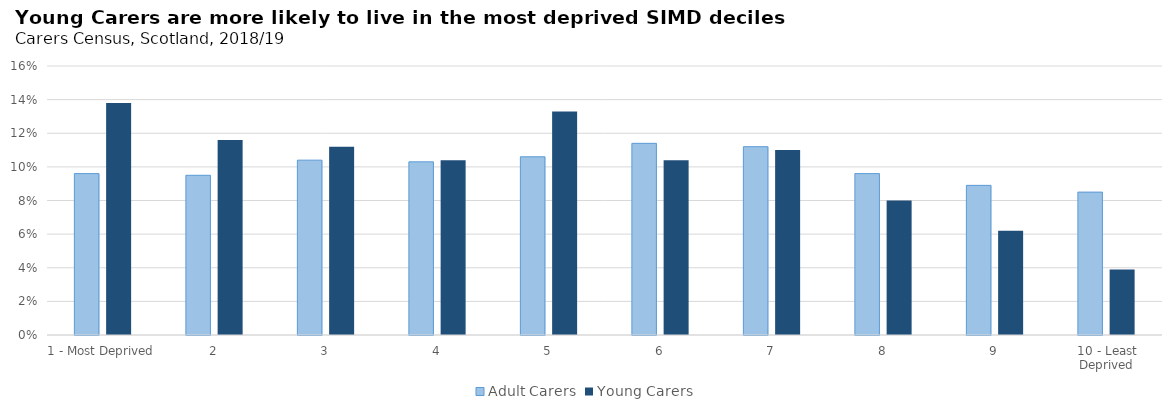
| Category | Adult Carers | Young Carers |
|---|---|---|
| 1 - Most Deprived | 0.096 | 0.138 |
| 2 | 0.095 | 0.116 |
| 3 | 0.104 | 0.112 |
| 4 | 0.103 | 0.104 |
| 5 | 0.106 | 0.133 |
| 6 | 0.114 | 0.104 |
| 7 | 0.112 | 0.11 |
| 8 | 0.096 | 0.08 |
| 9 | 0.089 | 0.062 |
| 10 - Least Deprived | 0.085 | 0.039 |